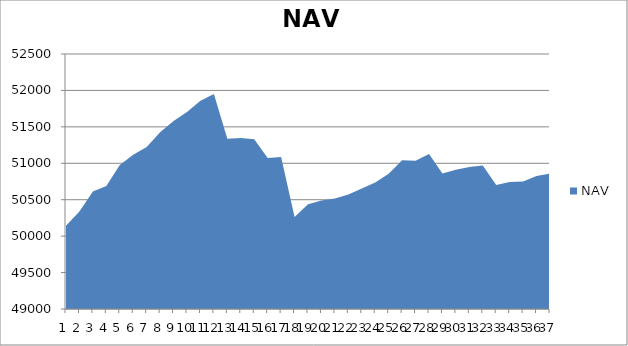
| Category | NAV |
|---|---|
| 0 | 50142.343 |
| 1 | 50336.57 |
| 2 | 50612.255 |
| 3 | 50687.913 |
| 4 | 50975.413 |
| 5 | 51115.874 |
| 6 | 51223.542 |
| 7 | 51427.364 |
| 8 | 51580.567 |
| 9 | 51704.692 |
| 10 | 51858.016 |
| 11 | 51951.766 |
| 12 | 51336.067 |
| 13 | 51345.356 |
| 14 | 51328.667 |
| 15 | 51072.985 |
| 16 | 51085.199 |
| 17 | 50261.67 |
| 18 | 50438.394 |
| 19 | 50489.896 |
| 20 | 50518.251 |
| 21 | 50572.468 |
| 22 | 50655.55 |
| 23 | 50737.787 |
| 24 | 50856.035 |
| 25 | 51041.806 |
| 26 | 51034.925 |
| 27 | 51128.589 |
| 28 | 50859.456 |
| 29 | 50911.137 |
| 30 | 50950.007 |
| 31 | 50970.175 |
| 32 | 50701.326 |
| 33 | 50743.495 |
| 34 | 50751.546 |
| 35 | 50826.725 |
| 36 | 50856.974 |